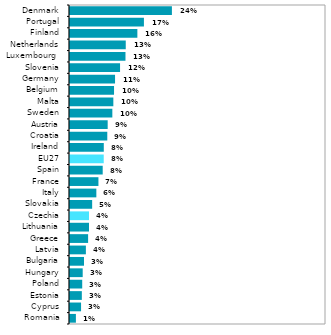
| Category | Series 1 |
|---|---|
| Romania | 0.014 |
| Cyprus | 0.026 |
| Estonia | 0.028 |
| Poland | 0.029 |
| Hungary | 0.03 |
| Bulgaria | 0.033 |
| Latvia | 0.037 |
| Greece | 0.042 |
| Lithuania | 0.045 |
| Czechia | 0.045 |
| Slovakia | 0.052 |
| Italy | 0.062 |
| France | 0.067 |
| Spain | 0.077 |
| EU27 | 0.079 |
| Ireland | 0.079 |
| Croatia | 0.087 |
| Austria | 0.088 |
| Sweden | 0.099 |
| Malta | 0.102 |
| Belgium | 0.103 |
| Germany | 0.106 |
| Slovenia | 0.117 |
| Luxembourg  | 0.13 |
| Netherlands | 0.131 |
| Finland | 0.158 |
| Portugal | 0.173 |
| Denmark | 0.239 |